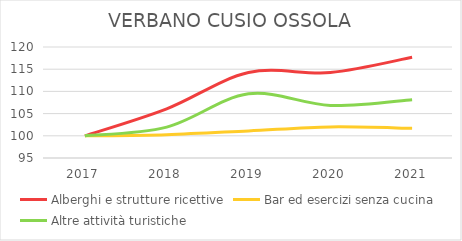
| Category | Alberghi e strutture ricettive | Bar ed esercizi senza cucina | Altre attività turistiche |
|---|---|---|---|
| 2017.0 | 100 | 100 | 100 |
| 2018.0 | 106.069 | 100.258 | 101.954 |
| 2019.0 | 114.248 | 101.098 | 109.446 |
| 2020.0 | 114.248 | 102.003 | 106.84 |
| 2021.0 | 117.678 | 101.68 | 108.143 |